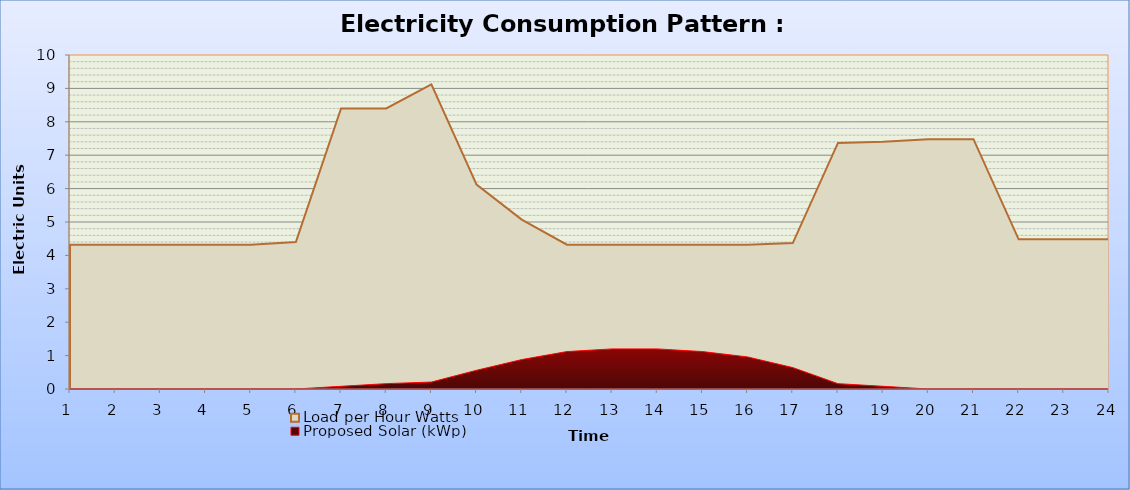
| Category | Load per Hour Watts | Proposed Solar (kWp) |
|---|---|---|
| 0 | 4.32 | 0 |
| 1 | 4.32 | 0 |
| 2 | 4.32 | 0 |
| 3 | 4.32 | 0 |
| 4 | 4.32 | 0 |
| 5 | 4.4 | 0 |
| 6 | 8.4 | 0.08 |
| 7 | 8.4 | 0.16 |
| 8 | 9.118 | 0.208 |
| 9 | 6.118 | 0.56 |
| 10 | 5.07 | 0.88 |
| 11 | 4.32 | 1.12 |
| 12 | 4.32 | 1.2 |
| 13 | 4.32 | 1.2 |
| 14 | 4.32 | 1.12 |
| 15 | 4.32 | 0.96 |
| 16 | 4.368 | 0.64 |
| 17 | 7.368 | 0.16 |
| 18 | 7.4 | 0.08 |
| 19 | 7.48 | 0 |
| 20 | 7.48 | 0 |
| 21 | 4.48 | 0 |
| 22 | 4.48 | 0 |
| 23 | 4.48 | 0 |